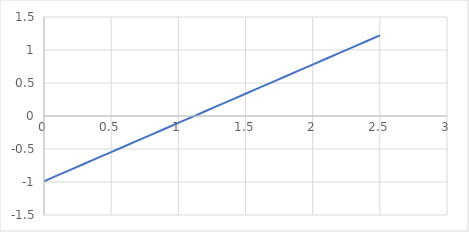
| Category | Series 0 |
|---|---|
| 0.0 | -0.989 |
| 0.1 | -0.901 |
| 0.2 | -0.812 |
| 0.30000000000000004 | -0.724 |
| 0.4 | -0.636 |
| 0.5 | -0.547 |
| 0.6 | -0.459 |
| 0.7 | -0.37 |
| 0.7999999999999999 | -0.282 |
| 0.8999999999999999 | -0.194 |
| 0.9999999999999999 | -0.105 |
| 1.0999999999999999 | -0.017 |
| 1.2 | 0.071 |
| 1.3 | 0.16 |
| 1.4000000000000001 | 0.248 |
| 1.5000000000000002 | 0.337 |
| 1.6000000000000003 | 0.425 |
| 1.7000000000000004 | 0.513 |
| 1.8000000000000005 | 0.602 |
| 1.9000000000000006 | 0.69 |
| 2.0000000000000004 | 0.778 |
| 2.1000000000000005 | 0.867 |
| 2.2000000000000006 | 0.955 |
| 2.3000000000000007 | 1.044 |
| 2.400000000000001 | 1.132 |
| 2.500000000000001 | 1.22 |